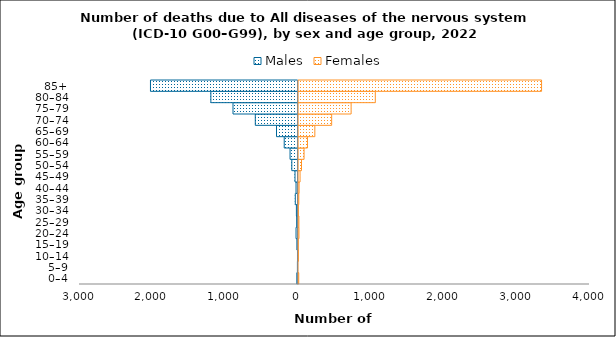
| Category | Males | Females |
|---|---|---|
| 0–4 | -17 | 16 |
| 5–9 | -9 | 5 |
| 10–14 | -8 | 11 |
| 15–19 | -16 | 8 |
| 20–24 | -28 | 19 |
| 25–29 | -19 | 18 |
| 30–34 | -23 | 10 |
| 35–39 | -38 | 17 |
| 40–44 | -28 | 21 |
| 45–49 | -42 | 34 |
| 50–54 | -86 | 54 |
| 55–59 | -110 | 89 |
| 60–64 | -190 | 136 |
| 65–69 | -296 | 237 |
| 70–74 | -587 | 468 |
| 75–79 | -893 | 735 |
| 80–84 | -1197 | 1067 |
| 85+ | -2026 | 3349 |